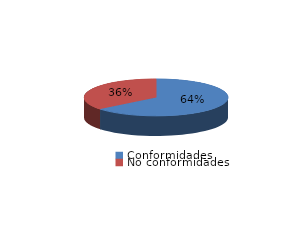
| Category | Series 0 |
|---|---|
| Conformidades | 2098 |
| No conformidades | 1175 |